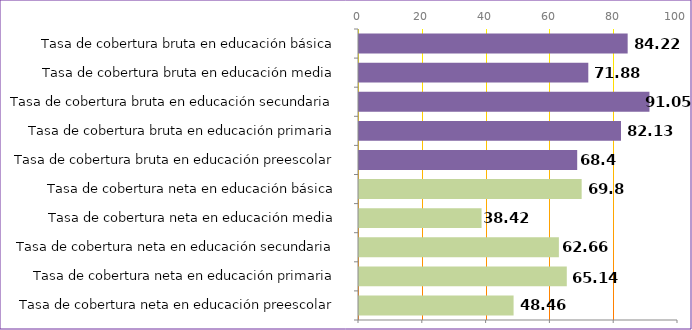
| Category | Series 0 |
|---|---|
| Tasa de cobertura neta en educación preescolar | 48.46 |
| Tasa de cobertura neta en educación primaria | 65.14 |
| Tasa de cobertura neta en educación secundaria | 62.66 |
| Tasa de cobertura neta en educación media | 38.42 |
| Tasa de cobertura neta en educación básica | 69.8 |
| Tasa de cobertura bruta en educación preescolar | 68.4 |
| Tasa de cobertura bruta en educación primaria | 82.13 |
| Tasa de cobertura bruta en educación secundaria | 91.05 |
| Tasa de cobertura bruta en educación media | 71.88 |
| Tasa de cobertura bruta en educación básica | 84.22 |